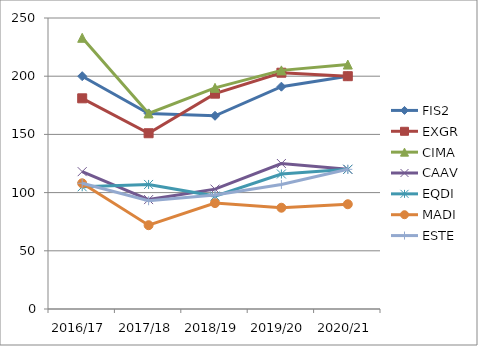
| Category | FIS2 | EXGR | CIMA | CAAV | EQDI | MADI | ESTE |
|---|---|---|---|---|---|---|---|
| 2016/17 | 200 | 181 | 233 | 118 | 105 | 108 | 108 |
| 2017/18 | 168 | 151 | 168 | 94 | 107 | 72 | 93 |
| 2018/19 | 166 | 185 | 190 | 103 | 97 | 91 | 98 |
| 2019/20 | 191 | 203 | 205 | 125 | 116 | 87 | 107 |
| 2020/21 | 200 | 200 | 210 | 120 | 120 | 90 | 120 |